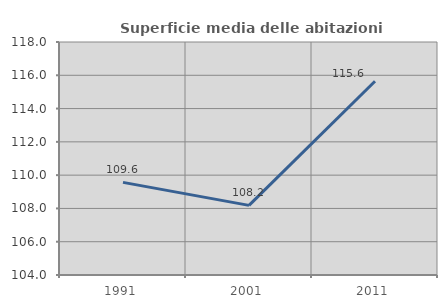
| Category | Superficie media delle abitazioni occupate |
|---|---|
| 1991.0 | 109.565 |
| 2001.0 | 108.184 |
| 2011.0 | 115.643 |